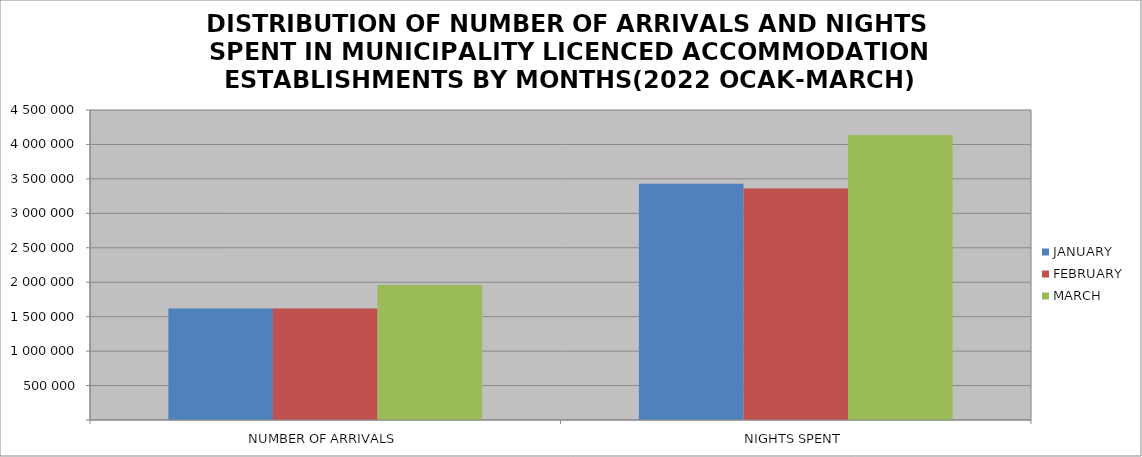
| Category | JANUARY | FEBRUARY | MARCH |
|---|---|---|---|
| NUMBER OF ARRIVALS | 1617436 | 1619305 | 1960867 |
| NIGHTS SPENT | 3427709 | 3362025 | 4136510 |